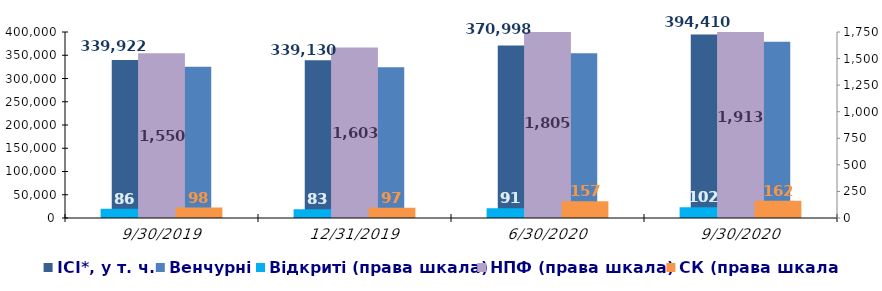
| Category | ІСІ*, у т. ч. | Венчурні |
|---|---|---|
| 9/30/19 | 339921.726 | 325109.898 |
| 12/31/19 | 339129.8 | 324105 |
| 6/30/20 | 370998.12 | 354500.31 |
| 9/30/20 | 394410 | 378795.6 |